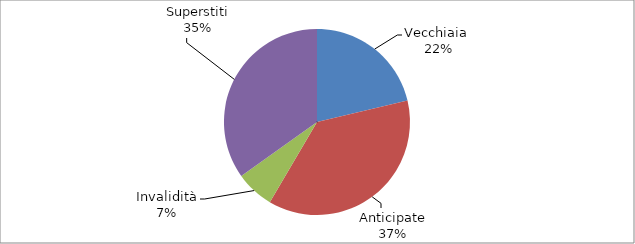
| Category | Series 0 |
|---|---|
| Vecchiaia  | 52998 |
| Anticipate | 92449 |
| Invalidità | 16620 |
| Superstiti | 86696 |